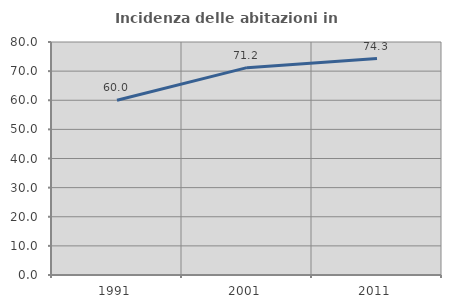
| Category | Incidenza delle abitazioni in proprietà  |
|---|---|
| 1991.0 | 59.989 |
| 2001.0 | 71.198 |
| 2011.0 | 74.314 |